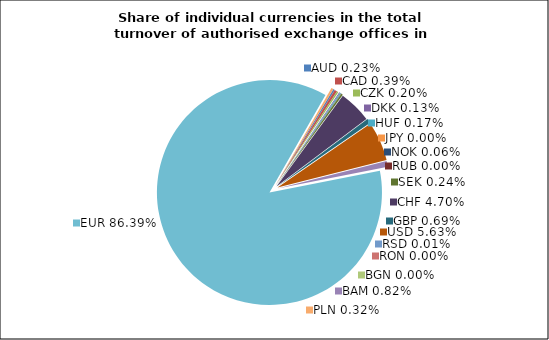
| Category | Series 0 |
|---|---|
| AUD | 0.225 |
| CAD | 0.385 |
| CZK | 0.198 |
| DKK | 0.133 |
| HUF | 0.174 |
| JPY | 0.004 |
| NOK | 0.059 |
| RUB | 0.001 |
| SEK | 0.244 |
| CHF | 4.702 |
| GBP | 0.693 |
| USD | 5.633 |
| RSD | 0.014 |
| RON | 0.002 |
| BGN | 0.001 |
| BAM | 0.818 |
| EUR | 86.393 |
| PLN | 0.321 |